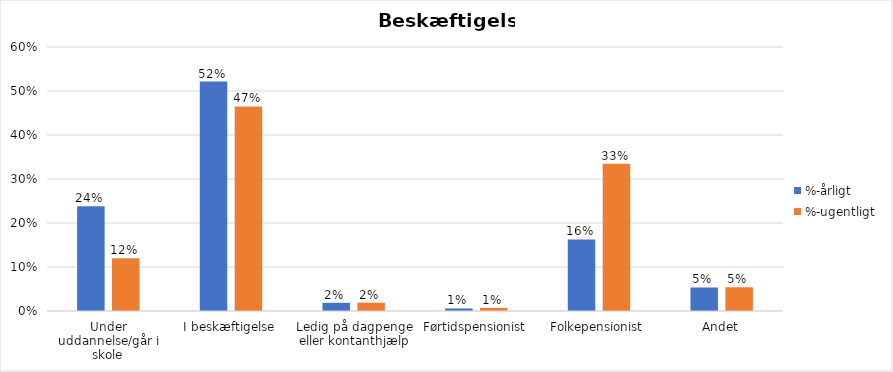
| Category | %-årligt | %-ugentligt |
|---|---|---|
| Under uddannelse/går i skole | 0.238 | 0.12 |
| I beskæftigelse | 0.522 | 0.465 |
| Ledig på dagpenge eller kontanthjælp | 0.019 | 0.019 |
| Førtidspensionist | 0.006 | 0.007 |
| Folkepensionist | 0.163 | 0.335 |
| Andet | 0.053 | 0.054 |